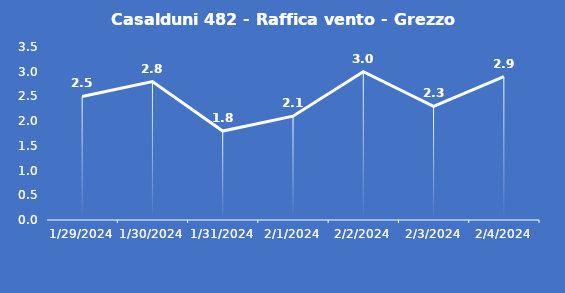
| Category | Casalduni 482 - Raffica vento - Grezzo (m/s) |
|---|---|
| 1/29/24 | 2.5 |
| 1/30/24 | 2.8 |
| 1/31/24 | 1.8 |
| 2/1/24 | 2.1 |
| 2/2/24 | 3 |
| 2/3/24 | 2.3 |
| 2/4/24 | 2.9 |